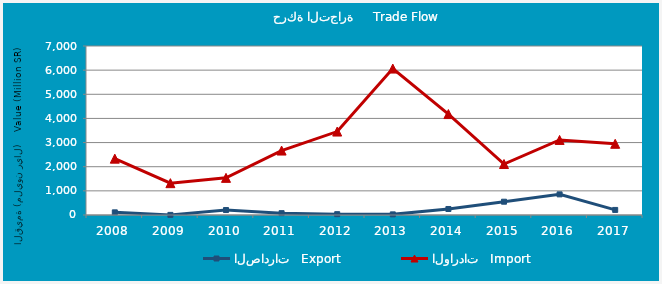
| Category | الصادرات   Export | الواردات   Import |
|---|---|---|
| 2008.0 | 109388726 | 2334390114 |
| 2009.0 | 5101162 | 1318384507 |
| 2010.0 | 205756857 | 1538234261 |
| 2011.0 | 76054266 | 2669422315 |
| 2012.0 | 34371421 | 3456007573 |
| 2013.0 | 26280730 | 6065408769 |
| 2014.0 | 248839480 | 4180752685 |
| 2015.0 | 550709482 | 2111673083 |
| 2016.0 | 854366959 | 3109390531 |
| 2017.0 | 209991428 | 2949421318 |